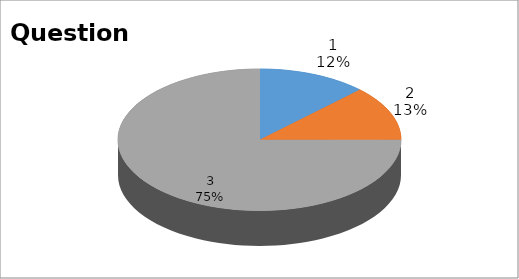
| Category | Series 0 |
|---|---|
| 0 | 1 |
| 1 | 1 |
| 2 | 6 |